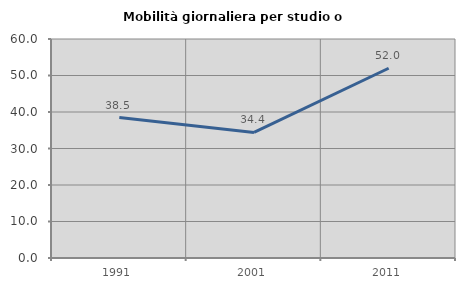
| Category | Mobilità giornaliera per studio o lavoro |
|---|---|
| 1991.0 | 38.462 |
| 2001.0 | 34.398 |
| 2011.0 | 51.991 |